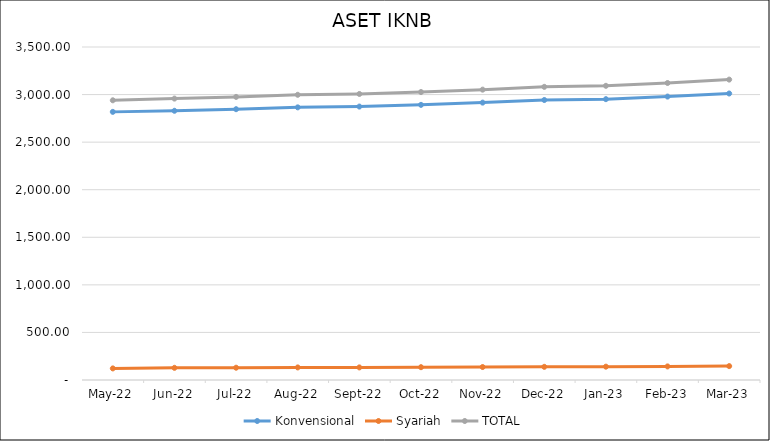
| Category |  Konvensional  |  Syariah  | TOTAL |
|---|---|---|---|
| 2022-05-01 | 2818.132 | 121.758 | 2939.89 |
| 2022-06-01 | 2829.665 | 128.036 | 2957.702 |
| 2022-07-01 | 2846.372 | 129.148 | 2975.52 |
| 2022-08-01 | 2865.619 | 132.075 | 2997.694 |
| 2022-09-01 | 2873.938 | 132.351 | 3006.289 |
| 2022-10-01 | 2891.826 | 134.628 | 3026.454 |
| 2022-11-01 | 2915.393 | 136.376 | 3051.769 |
| 2022-12-01 | 2942.716 | 138.533 | 3081.249 |
| 2023-01-01 | 2951.832 | 140.165 | 3091.997 |
| 2023-02-01 | 2978.913 | 142.696 | 3121.609 |
| 2023-03-01 | 3011.244 | 146.066 | 3157.31 |